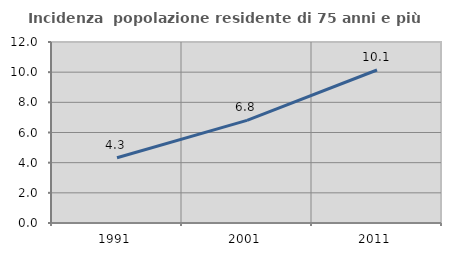
| Category | Incidenza  popolazione residente di 75 anni e più |
|---|---|
| 1991.0 | 4.323 |
| 2001.0 | 6.806 |
| 2011.0 | 10.142 |